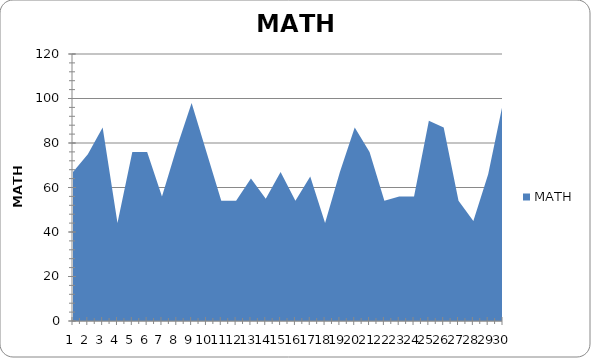
| Category | MATH |
|---|---|
| 0 | 67 |
| 1 | 75 |
| 2 | 87 |
| 3 | 44 |
| 4 | 76 |
| 5 | 76 |
| 6 | 56 |
| 7 | 78 |
| 8 | 98 |
| 9 | 76 |
| 10 | 54 |
| 11 | 54 |
| 12 | 64 |
| 13 | 55 |
| 14 | 67 |
| 15 | 54 |
| 16 | 65 |
| 17 | 44 |
| 18 | 67 |
| 19 | 87 |
| 20 | 76 |
| 21 | 54 |
| 22 | 56 |
| 23 | 56 |
| 24 | 90 |
| 25 | 87 |
| 26 | 54 |
| 27 | 45 |
| 28 | 66 |
| 29 | 98 |